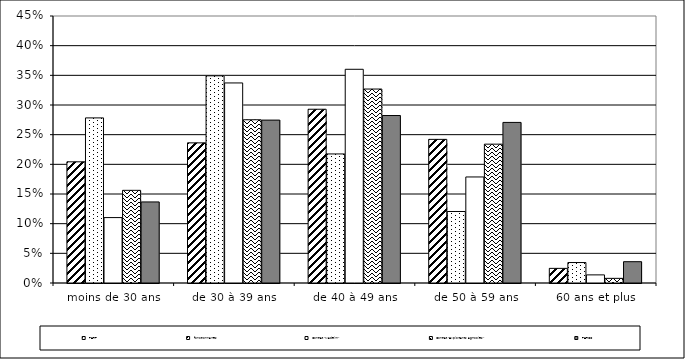
| Category | PERP | fonctionnaires | Contrat "Madelin" | Contrat "Exploitants agricoles" | PERCO |
|---|---|---|---|---|---|
| moins de 30 ans | 0.204 | 0.278 | 0.11 | 0.156 | 0.137 |
| de 30 à 39 ans | 0.236 | 0.349 | 0.337 | 0.275 | 0.275 |
| de 40 à 49 ans | 0.293 | 0.218 | 0.36 | 0.327 | 0.282 |
| de 50 à 59 ans | 0.242 | 0.121 | 0.179 | 0.234 | 0.271 |
| 60 ans et plus | 0.025 | 0.034 | 0.014 | 0.008 | 0.036 |